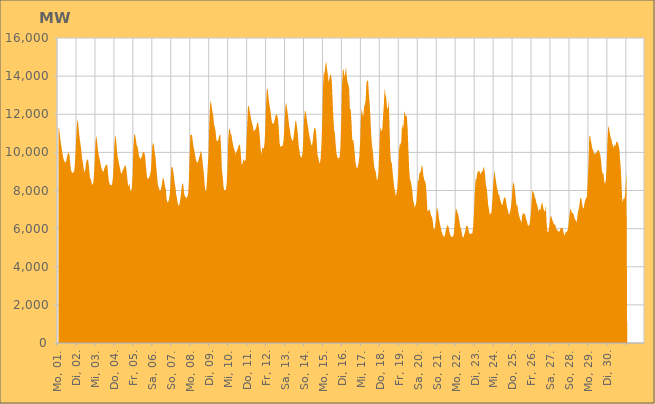
| Category | Series 0 |
|---|---|
|  Mo, 01.  | 11346.207 |
|  Mo, 01.  | 11222.551 |
|  Mo, 01.  | 10846.035 |
|  Mo, 01.  | 10507.576 |
|  Mo, 01.  | 10252.535 |
|  Mo, 01.  | 9976.906 |
|  Mo, 01.  | 9748.049 |
|  Mo, 01.  | 9577.964 |
|  Mo, 01.  | 9515.602 |
|  Mo, 01.  | 9453.382 |
|  Mo, 01.  | 9545.733 |
|  Mo, 01.  | 9784.974 |
|  Mo, 01.  | 9930.988 |
|  Mo, 01.  | 9993.023 |
|  Mo, 01.  | 9881.151 |
|  Mo, 01.  | 9410.052 |
|  Mo, 01.  | 9064.562 |
|  Di, 02.  | 8957.372 |
|  Di, 02.  | 8918.736 |
|  Di, 02.  | 8954.712 |
|  Di, 02.  | 9011.87 |
|  Di, 02.  | 9432.123 |
|  Di, 02.  | 10286.635 |
|  Di, 02.  | 11168.197 |
|  Di, 02.  | 11739.795 |
|  Di, 02.  | 11546.377 |
|  Di, 02.  | 11077.698 |
|  Di, 02.  | 10702.546 |
|  Di, 02.  | 10421.782 |
|  Di, 02.  | 10099.712 |
|  Di, 02.  | 9680.487 |
|  Di, 02.  | 9468.228 |
|  Di, 02.  | 9152.224 |
|  Di, 02.  | 8946.114 |
|  Di, 02.  | 9087.899 |
|  Di, 02.  | 9478.964 |
|  Di, 02.  | 9589.062 |
|  Di, 02.  | 9646.255 |
|  Di, 02.  | 9525.554 |
|  Di, 02.  | 9089.667 |
|  Di, 02.  | 8626.634 |
|  Mi, 03.  | 8604.978 |
|  Mi, 03.  | 8409.048 |
|  Mi, 03.  | 8286.256 |
|  Mi, 03.  | 8377.184 |
|  Mi, 03.  | 8761.915 |
|  Mi, 03.  | 9588.214 |
|  Mi, 03.  | 10560.089 |
|  Mi, 03.  | 10882.803 |
|  Mi, 03.  | 10561.144 |
|  Mi, 03.  | 10123.072 |
|  Mi, 03.  | 9863.461 |
|  Mi, 03.  | 9680.818 |
|  Mi, 03.  | 9492.54 |
|  Mi, 03.  | 9265.386 |
|  Mi, 03.  | 9114.604 |
|  Mi, 03.  | 9023.149 |
|  Mi, 03.  | 8972.851 |
|  Mi, 03.  | 9135.016 |
|  Mi, 03.  | 9240.177 |
|  Mi, 03.  | 9336.273 |
|  Mi, 03.  | 9372.894 |
|  Mi, 03.  | 9294.744 |
|  Mi, 03.  | 8810.885 |
|  Mi, 03.  | 8461.788 |
|  Do, 04.  | 8328.279 |
|  Do, 04.  | 8286.356 |
|  Do, 04.  | 8260.568 |
|  Do, 04.  | 8342.468 |
|  Do, 04.  | 8679.949 |
|  Do, 04.  | 9436.081 |
|  Do, 04.  | 10439.443 |
|  Do, 04.  | 10929.836 |
|  Do, 04.  | 10694.112 |
|  Do, 04.  | 10156.274 |
|  Do, 04.  | 9762.588 |
|  Do, 04.  | 9576.637 |
|  Do, 04.  | 9346.404 |
|  Do, 04.  | 9169.024 |
|  Do, 04.  | 8941.413 |
|  Do, 04.  | 8872.129 |
|  Do, 04.  | 9024.279 |
|  Do, 04.  | 9095.272 |
|  Do, 04.  | 9170.56 |
|  Do, 04.  | 9318.899 |
|  Do, 04.  | 9313.077 |
|  Do, 04.  | 9116.767 |
|  Do, 04.  | 8723.474 |
|  Do, 04.  | 8330.248 |
|  Fr, 05.  | 8205.089 |
|  Fr, 05.  | 8385.712 |
|  Fr, 05.  | 8014.927 |
|  Fr, 05.  | 7941.029 |
|  Fr, 05.  | 8202.085 |
|  Fr, 05.  | 8855.07 |
|  Fr, 05.  | 10334.924 |
|  Fr, 05.  | 10968.91 |
|  Fr, 05.  | 10912.896 |
|  Fr, 05.  | 10696.598 |
|  Fr, 05.  | 10391.606 |
|  Fr, 05.  | 10308.561 |
|  Fr, 05.  | 10106.294 |
|  Fr, 05.  | 9816.405 |
|  Fr, 05.  | 9704.919 |
|  Fr, 05.  | 9645.587 |
|  Fr, 05.  | 9722.108 |
|  Fr, 05.  | 9830.434 |
|  Fr, 05.  | 10032.164 |
|  Fr, 05.  | 10004.362 |
|  Fr, 05.  | 9962.905 |
|  Fr, 05.  | 9689.026 |
|  Fr, 05.  | 9201.149 |
|  Fr, 05.  | 8746.603 |
|  Sa, 06.  | 8603.776 |
|  Sa, 06.  | 8619.064 |
|  Sa, 06.  | 8702.854 |
|  Sa, 06.  | 8821.644 |
|  Sa, 06.  | 9035.565 |
|  Sa, 06.  | 9687.083 |
|  Sa, 06.  | 10356.675 |
|  Sa, 06.  | 10509.162 |
|  Sa, 06.  | 10349.606 |
|  Sa, 06.  | 9958.592 |
|  Sa, 06.  | 9732.531 |
|  Sa, 06.  | 9186.987 |
|  Sa, 06.  | 8702.534 |
|  Sa, 06.  | 8284.921 |
|  Sa, 06.  | 8172.035 |
|  Sa, 06.  | 8022.392 |
|  Sa, 06.  | 7976.382 |
|  Sa, 06.  | 8095.275 |
|  Sa, 06.  | 8312.756 |
|  Sa, 06.  | 8611.851 |
|  Sa, 06.  | 8660.126 |
|  Sa, 06.  | 8472.186 |
|  Sa, 06.  | 8201.636 |
|  Sa, 06.  | 8047.118 |
|  So, 07.  | 7533.97 |
|  So, 07.  | 7380.954 |
|  So, 07.  | 7402.196 |
|  So, 07.  | 7522.544 |
|  So, 07.  | 7789.553 |
|  So, 07.  | 8446.006 |
|  So, 07.  | 9236.074 |
|  So, 07.  | 9230.12 |
|  So, 07.  | 9113.924 |
|  So, 07.  | 8804.401 |
|  So, 07.  | 8441.876 |
|  So, 07.  | 8211.512 |
|  So, 07.  | 7827.859 |
|  So, 07.  | 7610.811 |
|  So, 07.  | 7359.626 |
|  So, 07.  | 7210.333 |
|  So, 07.  | 7228.789 |
|  So, 07.  | 7454.485 |
|  So, 07.  | 7774.664 |
|  So, 07.  | 8163.381 |
|  So, 07.  | 8380.339 |
|  So, 07.  | 8340.376 |
|  So, 07.  | 7887.384 |
|  So, 07.  | 7707.199 |
|  Mo, 08.  | 7676.296 |
|  Mo, 08.  | 7574.318 |
|  Mo, 08.  | 7696.094 |
|  Mo, 08.  | 7726.164 |
|  Mo, 08.  | 8359.825 |
|  Mo, 08.  | 9628.848 |
|  Mo, 08.  | 10895.694 |
|  Mo, 08.  | 10927.742 |
|  Mo, 08.  | 10928.357 |
|  Mo, 08.  | 10587.653 |
|  Mo, 08.  | 10281.916 |
|  Mo, 08.  | 10105.373 |
|  Mo, 08.  | 9849.979 |
|  Mo, 08.  | 9647.921 |
|  Mo, 08.  | 9492.29 |
|  Mo, 08.  | 9463.07 |
|  Mo, 08.  | 9520.603 |
|  Mo, 08.  | 9719.157 |
|  Mo, 08.  | 9835.816 |
|  Mo, 08.  | 10067.899 |
|  Mo, 08.  | 9996.825 |
|  Mo, 08.  | 9703.958 |
|  Mo, 08.  | 9287.624 |
|  Mo, 08.  | 8959.243 |
|  Di, 09.  | 8379.304 |
|  Di, 09.  | 7980.842 |
|  Di, 09.  | 7968.135 |
|  Di, 09.  | 8470.746 |
|  Di, 09.  | 9255.838 |
|  Di, 09.  | 9903.078 |
|  Di, 09.  | 11521.669 |
|  Di, 09.  | 12507.043 |
|  Di, 09.  | 12718.565 |
|  Di, 09.  | 12388.575 |
|  Di, 09.  | 12118.07 |
|  Di, 09.  | 11922.798 |
|  Di, 09.  | 11467.531 |
|  Di, 09.  | 11327.97 |
|  Di, 09.  | 11104.302 |
|  Di, 09.  | 10621.796 |
|  Di, 09.  | 10607.255 |
|  Di, 09.  | 10595.224 |
|  Di, 09.  | 10751.158 |
|  Di, 09.  | 10928.422 |
|  Di, 09.  | 10904.268 |
|  Di, 09.  | 10177.625 |
|  Di, 09.  | 9049.185 |
|  Di, 09.  | 8717.26 |
|  Mi, 10.  | 8177.296 |
|  Mi, 10.  | 8018.549 |
|  Mi, 10.  | 8012.37 |
|  Mi, 10.  | 8040.416 |
|  Mi, 10.  | 8376.712 |
|  Mi, 10.  | 9137.208 |
|  Mi, 10.  | 10664.154 |
|  Mi, 10.  | 11218.379 |
|  Mi, 10.  | 11226.264 |
|  Mi, 10.  | 10974.139 |
|  Mi, 10.  | 10926.043 |
|  Mi, 10.  | 10622.449 |
|  Mi, 10.  | 10420.264 |
|  Mi, 10.  | 10223.562 |
|  Mi, 10.  | 10117.814 |
|  Mi, 10.  | 9882.894 |
|  Mi, 10.  | 10025.223 |
|  Mi, 10.  | 10067.562 |
|  Mi, 10.  | 10181.295 |
|  Mi, 10.  | 10339.837 |
|  Mi, 10.  | 10425.182 |
|  Mi, 10.  | 10339.589 |
|  Mi, 10.  | 9856.812 |
|  Mi, 10.  | 9349.816 |
|  Do, 11.  | 9396.073 |
|  Do, 11.  | 9634.01 |
|  Do, 11.  | 9579.985 |
|  Do, 11.  | 9541.697 |
|  Do, 11.  | 9639.135 |
|  Do, 11.  | 10413.328 |
|  Do, 11.  | 11448.657 |
|  Do, 11.  | 12430.65 |
|  Do, 11.  | 12424.313 |
|  Do, 11.  | 12223.115 |
|  Do, 11.  | 11948.937 |
|  Do, 11.  | 11716.441 |
|  Do, 11.  | 11551.378 |
|  Do, 11.  | 11409.116 |
|  Do, 11.  | 11115.458 |
|  Do, 11.  | 11132.283 |
|  Do, 11.  | 11205.86 |
|  Do, 11.  | 11234.542 |
|  Do, 11.  | 11446.083 |
|  Do, 11.  | 11583.275 |
|  Do, 11.  | 11506.542 |
|  Do, 11.  | 11242.17 |
|  Do, 11.  | 10747.334 |
|  Do, 11.  | 10188.444 |
|  Fr, 12.  | 9868.942 |
|  Fr, 12.  | 10255.004 |
|  Fr, 12.  | 10218.802 |
|  Fr, 12.  | 10196.662 |
|  Fr, 12.  | 10519.115 |
|  Fr, 12.  | 11370.615 |
|  Fr, 12.  | 12689.63 |
|  Fr, 12.  | 13383.535 |
|  Fr, 12.  | 13258.483 |
|  Fr, 12.  | 12867.682 |
|  Fr, 12.  | 12522.628 |
|  Fr, 12.  | 12320.493 |
|  Fr, 12.  | 11979.677 |
|  Fr, 12.  | 11650.935 |
|  Fr, 12.  | 11526.588 |
|  Fr, 12.  | 11470.788 |
|  Fr, 12.  | 11585.036 |
|  Fr, 12.  | 11749.326 |
|  Fr, 12.  | 11949.807 |
|  Fr, 12.  | 11991.304 |
|  Fr, 12.  | 11947.629 |
|  Fr, 12.  | 11741.653 |
|  Fr, 12.  | 11226.565 |
|  Fr, 12.  | 10471.379 |
|  Sa, 13.  | 10271.232 |
|  Sa, 13.  | 10347.013 |
|  Sa, 13.  | 10305.663 |
|  Sa, 13.  | 10359.212 |
|  Sa, 13.  | 10608.351 |
|  Sa, 13.  | 11277.414 |
|  Sa, 13.  | 12171.836 |
|  Sa, 13.  | 12609.811 |
|  Sa, 13.  | 12431.4 |
|  Sa, 13.  | 12107.671 |
|  Sa, 13.  | 11815.325 |
|  Sa, 13.  | 11427.969 |
|  Sa, 13.  | 11188.009 |
|  Sa, 13.  | 10867.236 |
|  Sa, 13.  | 10745.127 |
|  Sa, 13.  | 10609.163 |
|  Sa, 13.  | 10621.304 |
|  Sa, 13.  | 10903.836 |
|  Sa, 13.  | 11238.177 |
|  Sa, 13.  | 11654.72 |
|  Sa, 13.  | 11627.672 |
|  Sa, 13.  | 11339.865 |
|  Sa, 13.  | 10998.937 |
|  Sa, 13.  | 10414.614 |
|  So, 14.  | 10122.646 |
|  So, 14.  | 9820.802 |
|  So, 14.  | 9779.193 |
|  So, 14.  | 9708.987 |
|  So, 14.  | 9951.379 |
|  So, 14.  | 10677.292 |
|  So, 14.  | 11738.013 |
|  So, 14.  | 12173.176 |
|  So, 14.  | 12139.058 |
|  So, 14.  | 11862.953 |
|  So, 14.  | 11579.783 |
|  So, 14.  | 11315.981 |
|  So, 14.  | 11021.281 |
|  So, 14.  | 10816.568 |
|  So, 14.  | 10617.768 |
|  So, 14.  | 10410.467 |
|  So, 14.  | 10349.913 |
|  So, 14.  | 10603.16 |
|  So, 14.  | 11049.219 |
|  So, 14.  | 11272.073 |
|  So, 14.  | 11288.814 |
|  So, 14.  | 11109.314 |
|  So, 14.  | 10548.974 |
|  So, 14.  | 9871.012 |
|  Mo, 15.  | 9723.273 |
|  Mo, 15.  | 9520.925 |
|  Mo, 15.  | 9410.505 |
|  Mo, 15.  | 9709.486 |
|  Mo, 15.  | 10439.644 |
|  Mo, 15.  | 11682.329 |
|  Mo, 15.  | 13436.948 |
|  Mo, 15.  | 14263.979 |
|  Mo, 15.  | 14104.717 |
|  Mo, 15.  | 14603.172 |
|  Mo, 15.  | 14754.389 |
|  Mo, 15.  | 14366.384 |
|  Mo, 15.  | 14088.067 |
|  Mo, 15.  | 13669.15 |
|  Mo, 15.  | 13858.133 |
|  Mo, 15.  | 14052.662 |
|  Mo, 15.  | 14088.424 |
|  Mo, 15.  | 13773.385 |
|  Mo, 15.  | 12851.808 |
|  Mo, 15.  | 11851.879 |
|  Mo, 15.  | 11194.495 |
|  Mo, 15.  | 10997.96 |
|  Mo, 15.  | 10410.915 |
|  Mo, 15.  | 9923.242 |
|  Di, 16.  | 9774.086 |
|  Di, 16.  | 9657.16 |
|  Di, 16.  | 9723.647 |
|  Di, 16.  | 9739.554 |
|  Di, 16.  | 10285.998 |
|  Di, 16.  | 11660.791 |
|  Di, 16.  | 13470.715 |
|  Di, 16.  | 14291.331 |
|  Di, 16.  | 14378.286 |
|  Di, 16.  | 13973.371 |
|  Di, 16.  | 14112.275 |
|  Di, 16.  | 14502.931 |
|  Di, 16.  | 13982.65 |
|  Di, 16.  | 13678.34 |
|  Di, 16.  | 13557.111 |
|  Di, 16.  | 13354.007 |
|  Di, 16.  | 12264.485 |
|  Di, 16.  | 12269.147 |
|  Di, 16.  | 11572.679 |
|  Di, 16.  | 10631.664 |
|  Di, 16.  | 10661.392 |
|  Di, 16.  | 10473.32 |
|  Di, 16.  | 9980.188 |
|  Di, 16.  | 9487.678 |
|  Mi, 17.  | 9260.511 |
|  Mi, 17.  | 9151.497 |
|  Mi, 17.  | 9254.288 |
|  Mi, 17.  | 9461.278 |
|  Mi, 17.  | 9788.123 |
|  Mi, 17.  | 10613.194 |
|  Mi, 17.  | 11869.667 |
|  Mi, 17.  | 12305.414 |
|  Mi, 17.  | 12019.23 |
|  Mi, 17.  | 11856.399 |
|  Mi, 17.  | 12400.994 |
|  Mi, 17.  | 12514.186 |
|  Mi, 17.  | 12785.029 |
|  Mi, 17.  | 13677.547 |
|  Mi, 17.  | 13777.351 |
|  Mi, 17.  | 13749.725 |
|  Mi, 17.  | 13050.568 |
|  Mi, 17.  | 12565.565 |
|  Mi, 17.  | 11752.907 |
|  Mi, 17.  | 10898.097 |
|  Mi, 17.  | 10339.099 |
|  Mi, 17.  | 10073.049 |
|  Mi, 17.  | 9562.979 |
|  Mi, 17.  | 9179.928 |
|  Do, 18.  | 9071.908 |
|  Do, 18.  | 8921.586 |
|  Do, 18.  | 8555.966 |
|  Do, 18.  | 8570.673 |
|  Do, 18.  | 8924.265 |
|  Do, 18.  | 9843.216 |
|  Do, 18.  | 11051.204 |
|  Do, 18.  | 11342.789 |
|  Do, 18.  | 11083.479 |
|  Do, 18.  | 11219.95 |
|  Do, 18.  | 11888.465 |
|  Do, 18.  | 12572.761 |
|  Do, 18.  | 13380.52 |
|  Do, 18.  | 13007.433 |
|  Do, 18.  | 12872.725 |
|  Do, 18.  | 12296.077 |
|  Do, 18.  | 12302.642 |
|  Do, 18.  | 12722.27 |
|  Do, 18.  | 11625.601 |
|  Do, 18.  | 10052.555 |
|  Do, 18.  | 9500.456 |
|  Do, 18.  | 9451.26 |
|  Do, 18.  | 8985.226 |
|  Do, 18.  | 8584.63 |
|  Fr, 19.  | 8198.717 |
|  Fr, 19.  | 7958.882 |
|  Fr, 19.  | 7707.349 |
|  Fr, 19.  | 7871.307 |
|  Fr, 19.  | 8143.768 |
|  Fr, 19.  | 8755.894 |
|  Fr, 19.  | 10015.483 |
|  Fr, 19.  | 10416.988 |
|  Fr, 19.  | 10418.352 |
|  Fr, 19.  | 10588.863 |
|  Fr, 19.  | 11507.041 |
|  Fr, 19.  | 11216.487 |
|  Fr, 19.  | 11461.052 |
|  Fr, 19.  | 12182.791 |
|  Fr, 19.  | 11995.326 |
|  Fr, 19.  | 11892.46 |
|  Fr, 19.  | 11915.867 |
|  Fr, 19.  | 11292.123 |
|  Fr, 19.  | 10159.145 |
|  Fr, 19.  | 9106.552 |
|  Fr, 19.  | 8606.249 |
|  Fr, 19.  | 8494.257 |
|  Fr, 19.  | 8228.569 |
|  Fr, 19.  | 7979.685 |
|  Sa, 20.  | 7456.301 |
|  Sa, 20.  | 7357.514 |
|  Sa, 20.  | 7088.045 |
|  Sa, 20.  | 7214.948 |
|  Sa, 20.  | 7372.566 |
|  Sa, 20.  | 7902.784 |
|  Sa, 20.  | 8513.121 |
|  Sa, 20.  | 8525.837 |
|  Sa, 20.  | 8912.654 |
|  Sa, 20.  | 8933.944 |
|  Sa, 20.  | 9053.402 |
|  Sa, 20.  | 9370.032 |
|  Sa, 20.  | 9186.031 |
|  Sa, 20.  | 8762.404 |
|  Sa, 20.  | 8582.594 |
|  Sa, 20.  | 8482.015 |
|  Sa, 20.  | 8350.365 |
|  Sa, 20.  | 7856.184 |
|  Sa, 20.  | 6979.365 |
|  Sa, 20.  | 6894.006 |
|  Sa, 20.  | 6988.657 |
|  Sa, 20.  | 7015.002 |
|  Sa, 20.  | 6801.799 |
|  Sa, 20.  | 6653.658 |
|  So, 21.  | 6600.528 |
|  So, 21.  | 6344.275 |
|  So, 21.  | 5960.481 |
|  So, 21.  | 5966.223 |
|  So, 21.  | 6139.859 |
|  So, 21.  | 6551.131 |
|  So, 21.  | 7116.537 |
|  So, 21.  | 7032.072 |
|  So, 21.  | 6794.61 |
|  So, 21.  | 6445.837 |
|  So, 21.  | 6237.599 |
|  So, 21.  | 6051.16 |
|  So, 21.  | 5859.796 |
|  So, 21.  | 5724.382 |
|  So, 21.  | 5631.401 |
|  So, 21.  | 5563.959 |
|  So, 21.  | 5610.848 |
|  So, 21.  | 5828.297 |
|  So, 21.  | 6029.033 |
|  So, 21.  | 6130.979 |
|  So, 21.  | 6202.897 |
|  So, 21.  | 6044.295 |
|  So, 21.  | 5820.606 |
|  So, 21.  | 5683.494 |
|  Mo, 22.  | 5589.325 |
|  Mo, 22.  | 5559.649 |
|  Mo, 22.  | 5584.898 |
|  Mo, 22.  | 5617.437 |
|  Mo, 22.  | 5948.717 |
|  Mo, 22.  | 6500.53 |
|  Mo, 22.  | 7025.302 |
|  Mo, 22.  | 7013.609 |
|  Mo, 22.  | 6851.452 |
|  Mo, 22.  | 6759.528 |
|  Mo, 22.  | 6526.896 |
|  Mo, 22.  | 6265.896 |
|  Mo, 22.  | 6050.442 |
|  Mo, 22.  | 5919.398 |
|  Mo, 22.  | 5671.879 |
|  Mo, 22.  | 5553.087 |
|  Mo, 22.  | 5549.998 |
|  Mo, 22.  | 5748.838 |
|  Mo, 22.  | 5832.408 |
|  Mo, 22.  | 6108.794 |
|  Mo, 22.  | 6167.439 |
|  Mo, 22.  | 6129.526 |
|  Mo, 22.  | 5951.178 |
|  Mo, 22.  | 5750.754 |
|  Di, 23.  | 5733.132 |
|  Di, 23.  | 5704.82 |
|  Di, 23.  | 5765.432 |
|  Di, 23.  | 5757.037 |
|  Di, 23.  | 6081.833 |
|  Di, 23.  | 6849.674 |
|  Di, 23.  | 7796.074 |
|  Di, 23.  | 8559.534 |
|  Di, 23.  | 8585.294 |
|  Di, 23.  | 8866.791 |
|  Di, 23.  | 8993.475 |
|  Di, 23.  | 9022.98 |
|  Di, 23.  | 9011.826 |
|  Di, 23.  | 8854.087 |
|  Di, 23.  | 8897.842 |
|  Di, 23.  | 9006.297 |
|  Di, 23.  | 9011.078 |
|  Di, 23.  | 9250.963 |
|  Di, 23.  | 9147.445 |
|  Di, 23.  | 8881.657 |
|  Di, 23.  | 8319.528 |
|  Di, 23.  | 8160.613 |
|  Di, 23.  | 7755.812 |
|  Di, 23.  | 7234.628 |
|  Mi, 24.  | 7028.46 |
|  Mi, 24.  | 6709.841 |
|  Mi, 24.  | 6811.989 |
|  Mi, 24.  | 6799.942 |
|  Mi, 24.  | 7317.029 |
|  Mi, 24.  | 7994.745 |
|  Mi, 24.  | 8640.479 |
|  Mi, 24.  | 9053.05 |
|  Mi, 24.  | 8714.41 |
|  Mi, 24.  | 8454.892 |
|  Mi, 24.  | 8173.399 |
|  Mi, 24.  | 8001.57 |
|  Mi, 24.  | 7786.626 |
|  Mi, 24.  | 7789.394 |
|  Mi, 24.  | 7548.846 |
|  Mi, 24.  | 7421.671 |
|  Mi, 24.  | 7268.241 |
|  Mi, 24.  | 7241.519 |
|  Mi, 24.  | 7432.697 |
|  Mi, 24.  | 7602.254 |
|  Mi, 24.  | 7650.522 |
|  Mi, 24.  | 7594.668 |
|  Mi, 24.  | 7322.985 |
|  Mi, 24.  | 7092.628 |
|  Do, 25.  | 6968.018 |
|  Do, 25.  | 6756.128 |
|  Do, 25.  | 6762.752 |
|  Do, 25.  | 6930.211 |
|  Do, 25.  | 7189.028 |
|  Do, 25.  | 7628.566 |
|  Do, 25.  | 8245.007 |
|  Do, 25.  | 8447.011 |
|  Do, 25.  | 8283.283 |
|  Do, 25.  | 7954.296 |
|  Do, 25.  | 7509.012 |
|  Do, 25.  | 7191.75 |
|  Do, 25.  | 7246.18 |
|  Do, 25.  | 6891.62 |
|  Do, 25.  | 6701.408 |
|  Do, 25.  | 6550.161 |
|  Do, 25.  | 6429.868 |
|  Do, 25.  | 6305.143 |
|  Do, 25.  | 6655.734 |
|  Do, 25.  | 6809.562 |
|  Do, 25.  | 6797.676 |
|  Do, 25.  | 6772.62 |
|  Do, 25.  | 6705.257 |
|  Do, 25.  | 6498.223 |
|  Fr, 26.  | 6397.485 |
|  Fr, 26.  | 6204.035 |
|  Fr, 26.  | 6153.598 |
|  Fr, 26.  | 6165.773 |
|  Fr, 26.  | 6419.201 |
|  Fr, 26.  | 6796.809 |
|  Fr, 26.  | 7447.517 |
|  Fr, 26.  | 8010.358 |
|  Fr, 26.  | 7923.422 |
|  Fr, 26.  | 7867.127 |
|  Fr, 26.  | 7632.372 |
|  Fr, 26.  | 7564.763 |
|  Fr, 26.  | 7342.997 |
|  Fr, 26.  | 7263.639 |
|  Fr, 26.  | 7045.792 |
|  Fr, 26.  | 6887.21 |
|  Fr, 26.  | 7054.69 |
|  Fr, 26.  | 6964.144 |
|  Fr, 26.  | 7178.019 |
|  Fr, 26.  | 7390.175 |
|  Fr, 26.  | 7269.006 |
|  Fr, 26.  | 7029.311 |
|  Fr, 26.  | 6931.94 |
|  Fr, 26.  | 6899.322 |
|  Sa, 27.  | 7210.229 |
|  Sa, 27.  | 6303.452 |
|  Sa, 27.  | 5791.099 |
|  Sa, 27.  | 5838.22 |
|  Sa, 27.  | 6035.319 |
|  Sa, 27.  | 6372.717 |
|  Sa, 27.  | 6653.636 |
|  Sa, 27.  | 6641.387 |
|  Sa, 27.  | 6488.247 |
|  Sa, 27.  | 6368.072 |
|  Sa, 27.  | 6251.618 |
|  Sa, 27.  | 6221.849 |
|  Sa, 27.  | 6187.811 |
|  Sa, 27.  | 6007.028 |
|  Sa, 27.  | 5935.945 |
|  Sa, 27.  | 5891.992 |
|  Sa, 27.  | 5850.211 |
|  Sa, 27.  | 5828.825 |
|  Sa, 27.  | 5928.125 |
|  Sa, 27.  | 6054.692 |
|  Sa, 27.  | 6028.75 |
|  Sa, 27.  | 6061.827 |
|  Sa, 27.  | 5871.468 |
|  Sa, 27.  | 5689.269 |
|  So, 28.  | 5635.013 |
|  So, 28.  | 5831.737 |
|  So, 28.  | 5813.845 |
|  So, 28.  | 5854.856 |
|  So, 28.  | 5987.786 |
|  So, 28.  | 6337.1 |
|  So, 28.  | 6741.454 |
|  So, 28.  | 7073.039 |
|  So, 28.  | 6958.144 |
|  So, 28.  | 6830.649 |
|  So, 28.  | 6811.803 |
|  So, 28.  | 6769.532 |
|  So, 28.  | 6594.509 |
|  So, 28.  | 6476.978 |
|  So, 28.  | 6421.368 |
|  So, 28.  | 6334.597 |
|  So, 28.  | 6667.046 |
|  So, 28.  | 6944.669 |
|  So, 28.  | 7075.144 |
|  So, 28.  | 7455.691 |
|  So, 28.  | 7633.099 |
|  So, 28.  | 7553.083 |
|  So, 28.  | 7255.295 |
|  So, 28.  | 7078.512 |
|  Mo, 29.  | 7061.51 |
|  Mo, 29.  | 7360.981 |
|  Mo, 29.  | 7512.255 |
|  Mo, 29.  | 7604.109 |
|  Mo, 29.  | 7674.382 |
|  Mo, 29.  | 8523.71 |
|  Mo, 29.  | 9457.521 |
|  Mo, 29.  | 10873.731 |
|  Mo, 29.  | 10843.462 |
|  Mo, 29.  | 10625.343 |
|  Mo, 29.  | 10397.445 |
|  Mo, 29.  | 10165.816 |
|  Mo, 29.  | 10106.194 |
|  Mo, 29.  | 9969.171 |
|  Mo, 29.  | 9876.342 |
|  Mo, 29.  | 9967.627 |
|  Mo, 29.  | 9972.331 |
|  Mo, 29.  | 10060.395 |
|  Mo, 29.  | 10128.806 |
|  Mo, 29.  | 10112.836 |
|  Mo, 29.  | 9996.829 |
|  Mo, 29.  | 9845.599 |
|  Mo, 29.  | 9507.951 |
|  Mo, 29.  | 9020.647 |
|  Di, 30.  | 8904.816 |
|  Di, 30.  | 8865.858 |
|  Di, 30.  | 8436.428 |
|  Di, 30.  | 8363.162 |
|  Di, 30.  | 8594.38 |
|  Di, 30.  | 9313.471 |
|  Di, 30.  | 10645.029 |
|  Di, 30.  | 11421.693 |
|  Di, 30.  | 11255.403 |
|  Di, 30.  | 11007.26 |
|  Di, 30.  | 10781.684 |
|  Di, 30.  | 10689.151 |
|  Di, 30.  | 10453.188 |
|  Di, 30.  | 10349.289 |
|  Di, 30.  | 10224.565 |
|  Di, 30.  | 10428.798 |
|  Di, 30.  | 10326.051 |
|  Di, 30.  | 10528.363 |
|  Di, 30.  | 10564.518 |
|  Di, 30.  | 10531.249 |
|  Di, 30.  | 10367.925 |
|  Di, 30.  | 10201.225 |
|  Di, 30.  | 9584.724 |
|  Di, 30.  | 9040.227 |
|  Mi, 01.  | 8113.9 |
|  Mi, 01.  | 7351.055 |
|  Mi, 01.  | 7572.567 |
|  Mi, 01.  | 7530.595 |
|  Mi, 01.  | 7680.639 |
|  Mi, 01.  | 8232.69 |
|    | 8893.349 |
|    | 0 |
|    | 0 |
|    | 0 |
|    | 0 |
|    | 0 |
|    | 0 |
|    | 0 |
|    | 0 |
|    | 0 |
|    | 0 |
|    | 0 |
|    | 0 |
|    | 0 |
|    | 0 |
|    | 0 |
|    | 0 |
|    | 0 |
|    | 0 |
|    | 0 |
|    | 0 |
|    | 0 |
|    | 0 |
|    | 0 |